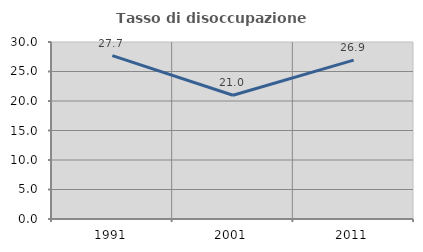
| Category | Tasso di disoccupazione giovanile  |
|---|---|
| 1991.0 | 27.684 |
| 2001.0 | 20.968 |
| 2011.0 | 26.923 |